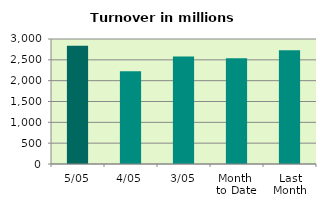
| Category | Series 0 |
|---|---|
| 5/05 | 2837.746 |
| 4/05 | 2227.427 |
| 3/05 | 2582.797 |
| Month 
to Date | 2538.101 |
| Last
Month | 2727.753 |